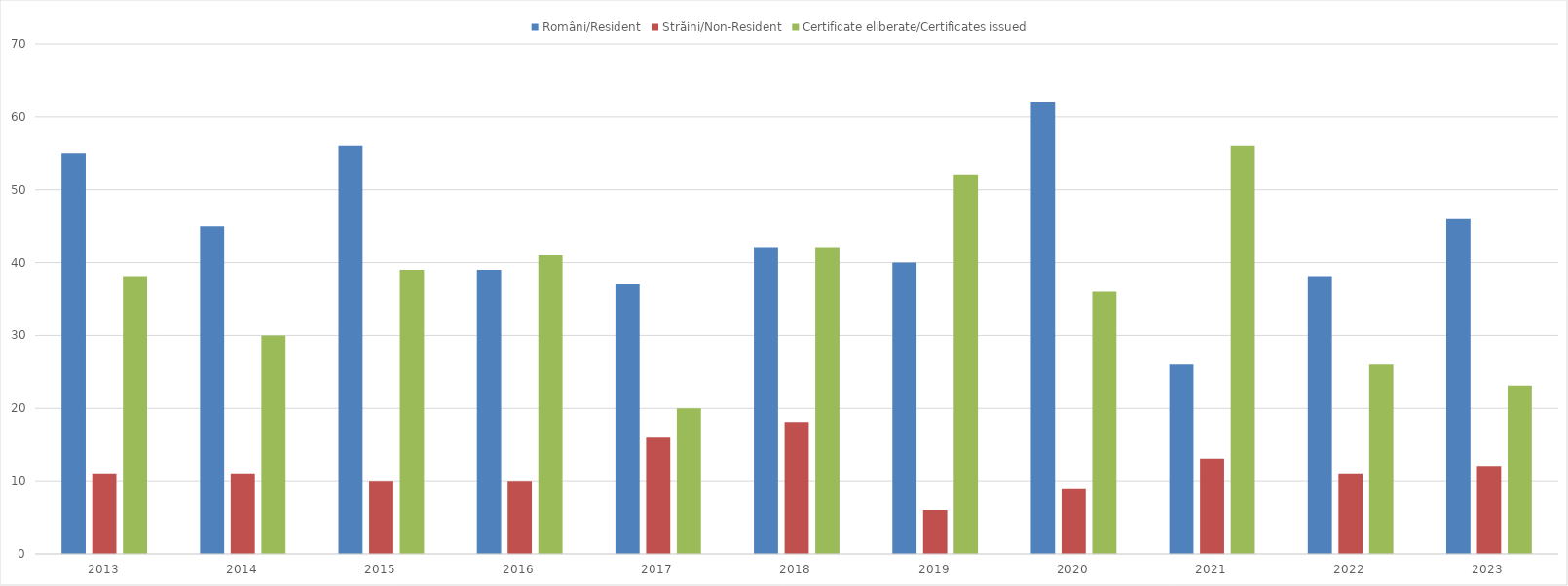
| Category | Români/Resident | Străini/Non-Resident | Certificate eliberate/Certificates issued |
|---|---|---|---|
| 2013.0 | 55 | 11 | 38 |
| 2014.0 | 45 | 11 | 30 |
| 2015.0 | 56 | 10 | 39 |
| 2016.0 | 39 | 10 | 41 |
| 2017.0 | 37 | 16 | 20 |
| 2018.0 | 42 | 18 | 42 |
| 2019.0 | 40 | 6 | 52 |
| 2020.0 | 62 | 9 | 36 |
| 2021.0 | 26 | 13 | 56 |
| 2022.0 | 38 | 11 | 26 |
| 2023.0 | 46 | 12 | 23 |